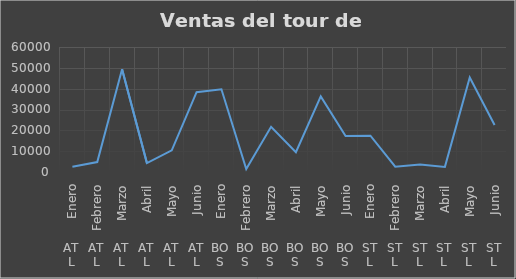
| Category | Series 0 |
|---|---|
| 0 | 2489 |
| 1 | 4787 |
| 2 | 49363 |
| 3 | 4258 |
| 4 | 10407 |
| 5 | 38304 |
| 6 | 39728 |
| 7 | 1441 |
| 8 | 21693 |
| 9 | 9486 |
| 10 | 36289 |
| 11 | 17258 |
| 12 | 17443 |
| 13 | 2571 |
| 14 | 3562 |
| 15 | 2453 |
| 16 | 45365 |
| 17 | 22541 |